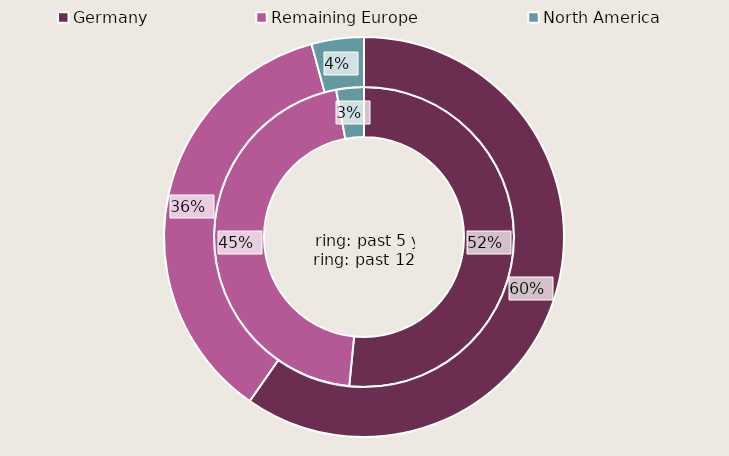
| Category | past 5 years | past 12 months |
|---|---|---|
| Germany | 1445119846.698 | 0.597 |
| Remaining Europe | 1273312992.552 | 0.361 |
| North America | 83467085.864 | 0.042 |